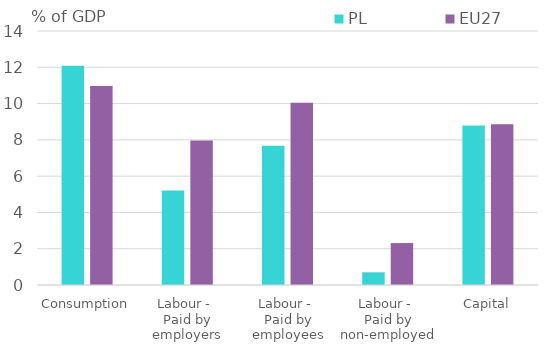
| Category | PL | EU27 |
|---|---|---|
| Consumption | 12.09 | 10.967 |
| Labour - 
Paid by employers | 5.209 | 7.966 |
| Labour - 
Paid by employees | 7.672 | 10.052 |
| Labour - 
Paid by non-employed | 0.701 | 2.311 |
| Capital | 8.789 | 8.858 |